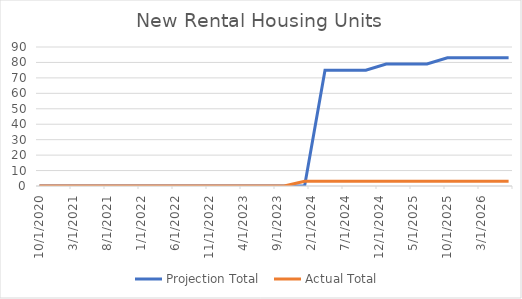
| Category | Projection Total  | Actual Total  |
|---|---|---|
| 10/1/20 | 0 | 0 |
| 1/1/21 | 0 | 0 |
| 4/1/21 | 0 | 0 |
| 7/1/21 | 0 | 0 |
| 10/1/21 | 0 | 0 |
| 1/1/22 | 0 | 0 |
| 4/1/22 | 0 | 0 |
| 7/1/22 | 0 | 0 |
| 10/1/22 | 0 | 0 |
| 1/1/23 | 0 | 0 |
| 4/1/23 | 0 | 0 |
| 7/1/23 | 0 | 0 |
| 10/1/23 | 0 | 0 |
| 1/1/24 | 0 | 3 |
| 4/1/24 | 75 | 3 |
| 7/1/24 | 75 | 3 |
| 10/1/24 | 75 | 3 |
| 1/1/25 | 79 | 3 |
| 4/1/25 | 79 | 3 |
| 7/1/25 | 79 | 3 |
| 10/1/25 | 83 | 3 |
| 1/1/26 | 83 | 3 |
| 4/1/26 | 83 | 3 |
| 7/1/26 | 83 | 3 |